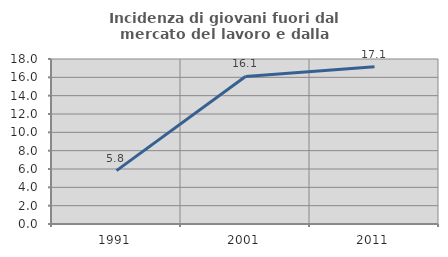
| Category | Incidenza di giovani fuori dal mercato del lavoro e dalla formazione  |
|---|---|
| 1991.0 | 5.825 |
| 2001.0 | 16.092 |
| 2011.0 | 17.143 |